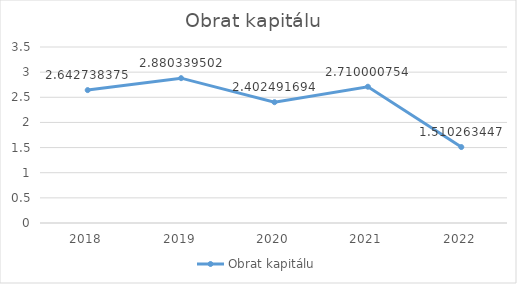
| Category | Obrat kapitálu |
|---|---|
| 2018.0 | 2.643 |
| 2019.0 | 2.88 |
| 2020.0 | 2.402 |
| 2021.0 | 2.71 |
| 2022.0 | 1.51 |